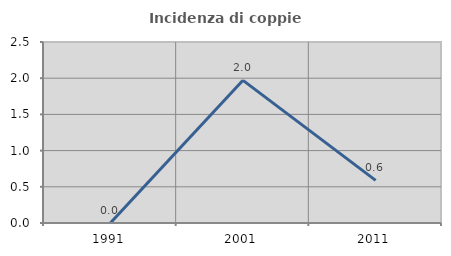
| Category | Incidenza di coppie miste |
|---|---|
| 1991.0 | 0 |
| 2001.0 | 1.97 |
| 2011.0 | 0.588 |